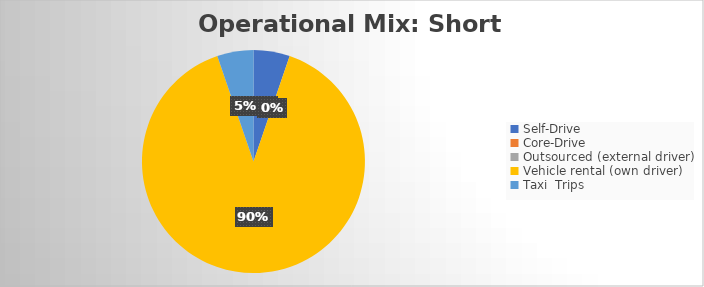
| Category | Series 0 |
|---|---|
| Self-Drive | 1 |
| Core-Drive | 0 |
| Outsourced (external driver) | 0 |
| Vehicle rental (own driver) | 17 |
| Taxi  Trips | 1 |